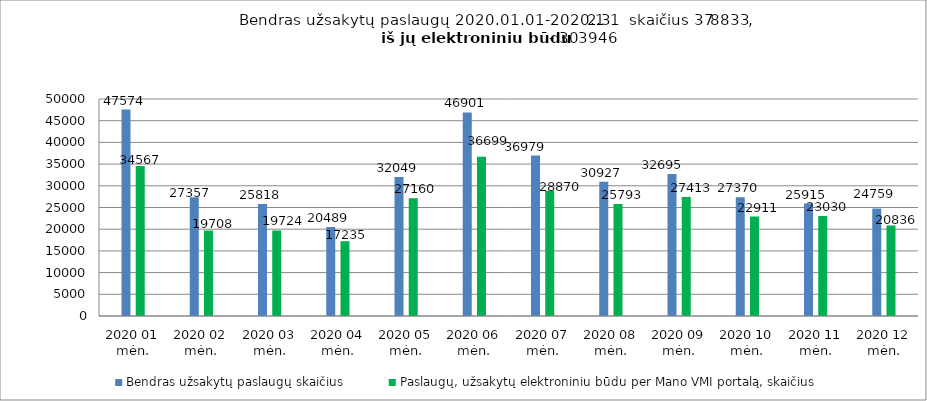
| Category | Bendras užsakytų paslaugų skaičius | Paslaugų, užsakytų elektroniniu būdu per Mano VMI portalą, skaičius |
|---|---|---|
| 2020 01 mėn. | 47574 | 34567 |
| 2020 02 mėn. | 27357 | 19708 |
| 2020 03 mėn. | 25818 | 19724 |
| 2020 04 mėn. | 20489 | 17235 |
| 2020 05 mėn. | 32049 | 27160 |
| 2020 06 mėn. | 46901 | 36699 |
| 2020 07 mėn. | 36979 | 28870 |
| 2020 08 mėn. | 30927 | 25793 |
| 2020 09 mėn. | 32695 | 27413 |
| 2020 10 mėn. | 27370 | 22911 |
| 2020 11 mėn. | 25915 | 23030 |
| 2020 12 mėn. | 24759 | 20836 |